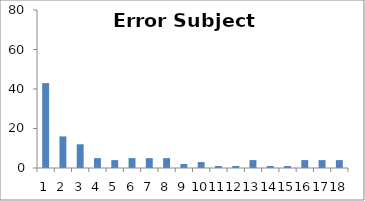
| Category | Sub15 |
|---|---|
| 0 | 43 |
| 1 | 16 |
| 2 | 12 |
| 3 | 5 |
| 4 | 4 |
| 5 | 5 |
| 6 | 5 |
| 7 | 5 |
| 8 | 2 |
| 9 | 3 |
| 10 | 1 |
| 11 | 1 |
| 12 | 4 |
| 13 | 1 |
| 14 | 1 |
| 15 | 4 |
| 16 | 4 |
| 17 | 4 |